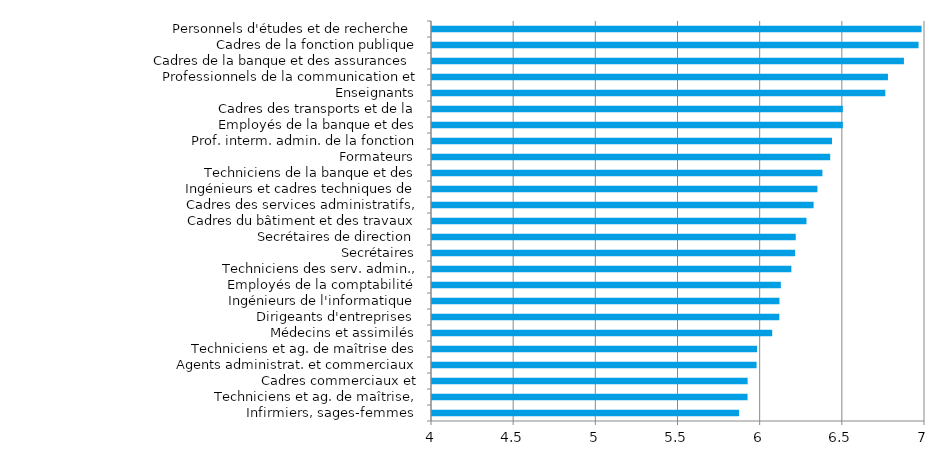
| Category | Series 0 |
|---|---|
| Infirmiers, sages-femmes | 5.869 |
| Techniciens et ag. de maîtrise, électricité-électronique | 5.92 |
| Cadres commerciaux et technico-commerciaux | 5.921 |
| Agents administrat. et commerciaux des transports | 5.975 |
| Techniciens et ag. de maîtrise des industries de process | 5.978 |
| Médecins et assimilés | 6.07 |
| Dirigeants d'entreprises | 6.114 |
| Ingénieurs de l'informatique | 6.114 |
| Employés de la comptabilité | 6.123 |
| Techniciens des serv. admin., comptables et financiers | 6.187 |
| Secrétaires | 6.21 |
| Secrétaires de direction | 6.213 |
| Cadres du bâtiment et des travaux publics | 6.279 |
| Cadres des services administratifs, comptables et financiers | 6.322 |
| Ingénieurs et cadres techniques de l'industrie | 6.345 |
| Techniciens de la banque et des assurances | 6.376 |
| Formateurs | 6.423 |
| Prof. interm. admin. de la fonction publique (cat. B et assimilés) | 6.434 |
| Employés de la banque et des assurances | 6.5 |
| Cadres des transports et de la logistique | 6.5 |
| Enseignants | 6.758 |
| Professionnels de la communication et de l'information | 6.775 |
| Cadres de la banque et des assurances | 6.872 |
| Cadres de la fonction publique (catégorie A et assimilés) | 6.961 |
| Personnels d'études et de recherche | 6.979 |